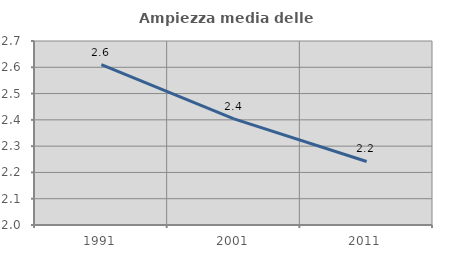
| Category | Ampiezza media delle famiglie |
|---|---|
| 1991.0 | 2.61 |
| 2001.0 | 2.404 |
| 2011.0 | 2.242 |